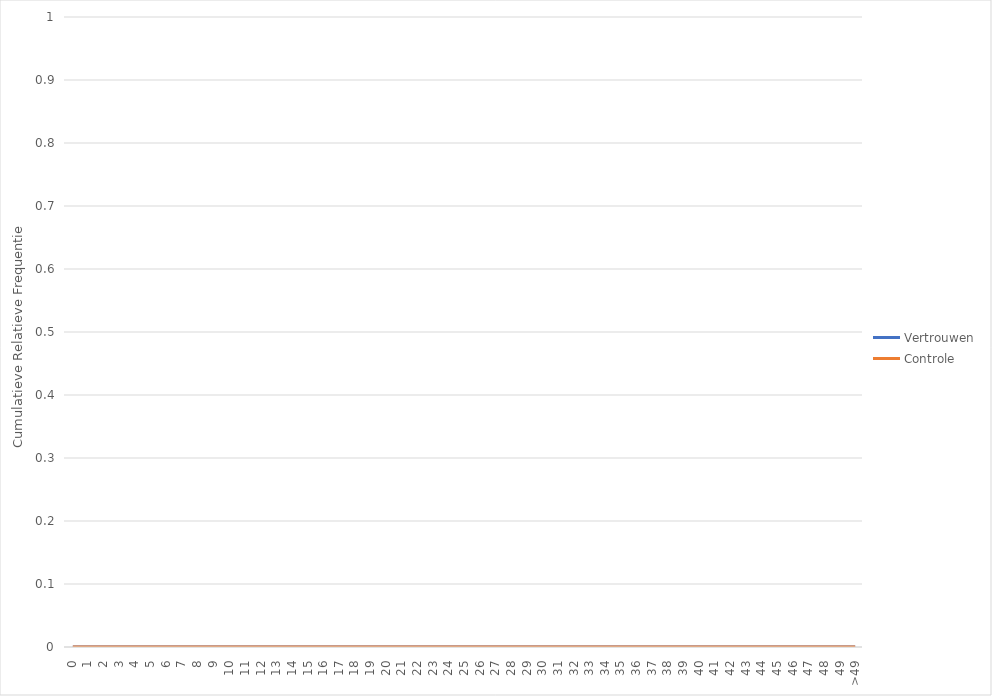
| Category | Vertrouwen | Controle |
|---|---|---|
| 0 | 0 | 0 |
| 1 | 0 | 0 |
| 2 | 0 | 0 |
| 3 | 0 | 0 |
| 4 | 0 | 0 |
| 5 | 0 | 0 |
| 6 | 0 | 0 |
| 7 | 0 | 0 |
| 8 | 0 | 0 |
| 9 | 0 | 0 |
| 10 | 0 | 0 |
| 11 | 0 | 0 |
| 12 | 0 | 0 |
| 13 | 0 | 0 |
| 14 | 0 | 0 |
| 15 | 0 | 0 |
| 16 | 0 | 0 |
| 17 | 0 | 0 |
| 18 | 0 | 0 |
| 19 | 0 | 0 |
| 20 | 0 | 0 |
| 21 | 0 | 0 |
| 22 | 0 | 0 |
| 23 | 0 | 0 |
| 24 | 0 | 0 |
| 25 | 0 | 0 |
| 26 | 0 | 0 |
| 27 | 0 | 0 |
| 28 | 0 | 0 |
| 29 | 0 | 0 |
| 30 | 0 | 0 |
| 31 | 0 | 0 |
| 32 | 0 | 0 |
| 33 | 0 | 0 |
| 34 | 0 | 0 |
| 35 | 0 | 0 |
| 36 | 0 | 0 |
| 37 | 0 | 0 |
| 38 | 0 | 0 |
| 39 | 0 | 0 |
| 40 | 0 | 0 |
| 41 | 0 | 0 |
| 42 | 0 | 0 |
| 43 | 0 | 0 |
| 44 | 0 | 0 |
| 45 | 0 | 0 |
| 46 | 0 | 0 |
| 47 | 0 | 0 |
| 48 | 0 | 0 |
| 49 | 0 | 0 |
| >49 | 0 | 0 |